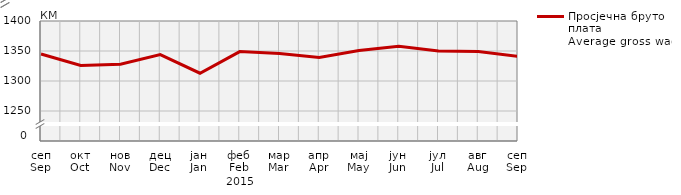
| Category | Просјечна бруто плата
Average gross wage |
|---|---|
| сеп
Sep | 1345 |
| окт
Oct | 1326 |
| нов
Nov | 1328 |
| дец
Dec | 1344 |
| јан
Jan | 1313 |
| феб
Feb | 1349 |
| мар
Mar | 1346 |
| апр
Apr | 1339 |
| мај
May | 1351 |
| јун
Jun | 1358 |
| јул
Jul | 1350 |
| авг
Aug | 1349 |
| сеп
Sep | 1341 |